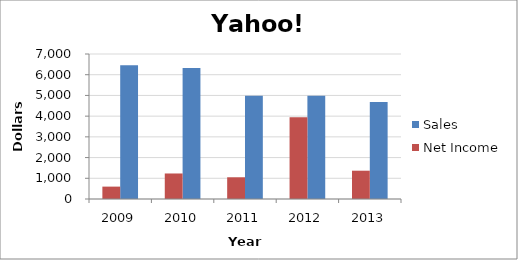
| Category | Sales | Net Income |
|---|---|---|
| 2013.0 | 4680 | 1366 |
| 2012.0 | 4987 | 3945 |
| 2011.0 | 4984 | 1049 |
| 2010.0 | 6325 | 1232 |
| 2009.0 | 6460 | 598 |